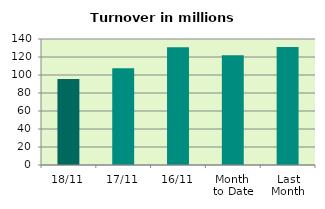
| Category | Series 0 |
|---|---|
| 18/11 | 95.658 |
| 17/11 | 107.538 |
| 16/11 | 130.759 |
| Month 
to Date | 122.026 |
| Last
Month | 131.017 |